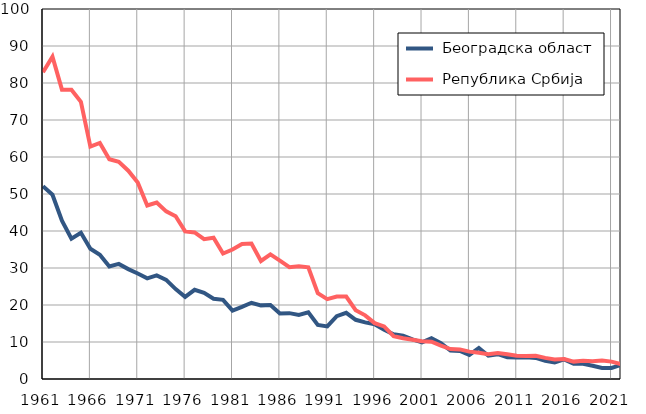
| Category |  Београдска област |  Република Србија |
|---|---|---|
| 1961.0 | 52.1 | 82.9 |
| 1962.0 | 49.8 | 87.1 |
| 1963.0 | 42.8 | 78.2 |
| 1964.0 | 37.9 | 78.2 |
| 1965.0 | 39.5 | 74.9 |
| 1966.0 | 35.2 | 62.8 |
| 1967.0 | 33.6 | 63.8 |
| 1968.0 | 30.4 | 59.4 |
| 1969.0 | 31.1 | 58.7 |
| 1970.0 | 29.7 | 56.3 |
| 1971.0 | 28.5 | 53.1 |
| 1972.0 | 27.2 | 46.9 |
| 1973.0 | 28 | 47.7 |
| 1974.0 | 26.8 | 45.3 |
| 1975.0 | 24.3 | 44 |
| 1976.0 | 22.2 | 39.9 |
| 1977.0 | 24.1 | 39.6 |
| 1978.0 | 23.3 | 37.8 |
| 1979.0 | 21.7 | 38.2 |
| 1980.0 | 21.4 | 33.9 |
| 1981.0 | 18.5 | 35 |
| 1982.0 | 19.5 | 36.5 |
| 1983.0 | 20.6 | 36.6 |
| 1984.0 | 19.9 | 31.9 |
| 1985.0 | 20 | 33.7 |
| 1986.0 | 17.7 | 32 |
| 1987.0 | 17.8 | 30.2 |
| 1988.0 | 17.3 | 30.5 |
| 1989.0 | 18 | 30.2 |
| 1990.0 | 14.6 | 23.2 |
| 1991.0 | 14.2 | 21.6 |
| 1992.0 | 17 | 22.3 |
| 1993.0 | 17.9 | 22.3 |
| 1994.0 | 16 | 18.6 |
| 1995.0 | 15.3 | 17.2 |
| 1996.0 | 14.8 | 15.1 |
| 1997.0 | 13.3 | 14.2 |
| 1998.0 | 12.1 | 11.6 |
| 1999.0 | 11.7 | 11 |
| 2000.0 | 10.7 | 10.6 |
| 2001.0 | 9.9 | 10.2 |
| 2002.0 | 11 | 10.1 |
| 2003.0 | 9.7 | 9 |
| 2004.0 | 7.7 | 8.1 |
| 2005.0 | 7.6 | 8 |
| 2006.0 | 6.5 | 7.4 |
| 2007.0 | 8.4 | 7.1 |
| 2008.0 | 6.3 | 6.7 |
| 2009.0 | 6.7 | 7 |
| 2010.0 | 5.9 | 6.7 |
| 2011.0 | 5.8 | 6.3 |
| 2012.0 | 5.9 | 6.2 |
| 2013.0 | 5.7 | 6.3 |
| 2014.0 | 4.9 | 5.7 |
| 2015.0 | 4.5 | 5.3 |
| 2016.0 | 5.3 | 5.4 |
| 2017.0 | 4.1 | 4.7 |
| 2018.0 | 4.1 | 4.9 |
| 2019.0 | 3.6 | 4.8 |
| 2020.0 | 3 | 5 |
| 2021.0 | 3 | 4.7 |
| 2022.0 | 3.8 | 4 |